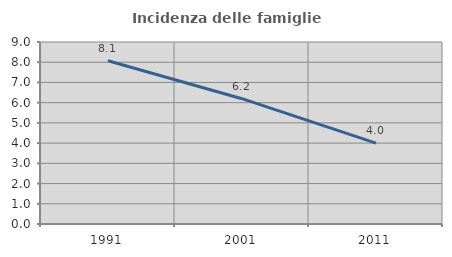
| Category | Incidenza delle famiglie numerose |
|---|---|
| 1991.0 | 8.075 |
| 2001.0 | 6.196 |
| 2011.0 | 4 |